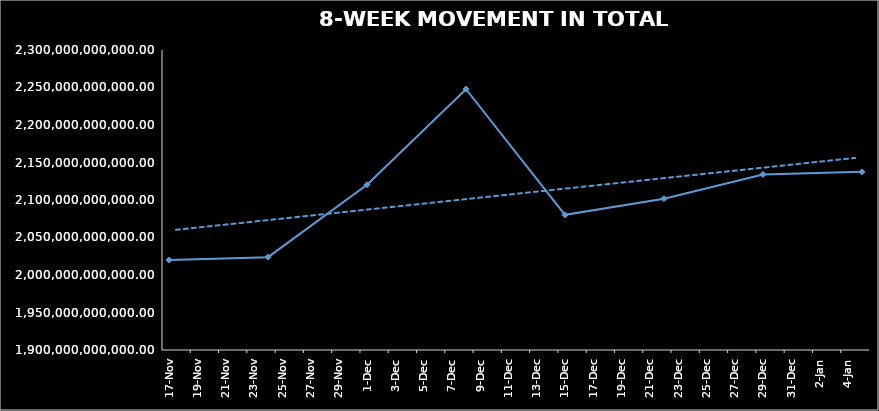
| Category | TOTAL NAV |
|---|---|
| 2023-11-17 | 2019879952817.294 |
| 2023-11-24 | 2023797867882.851 |
| 2023-12-01 | 2120381651104.615 |
| 2023-12-08 | 2247779681993.516 |
| 2023-12-15 | 2080204371491.043 |
| 2023-12-22 | 2101781808992.513 |
| 2023-12-29 | 2134044598687.964 |
| 2024-01-05 | 2137525044219.979 |